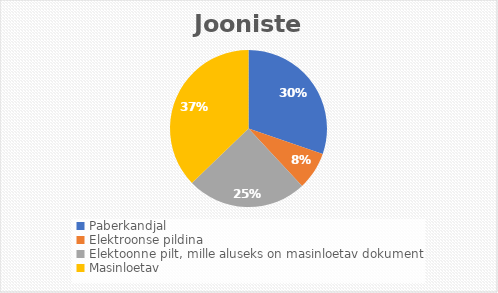
| Category | Series 0 |
|---|---|
| Paberkandjal | 4604 |
| Elektroonse pildina | 1181 |
| Elektoonne pilt, mille aluseks on masinloetav dokument | 3763 |
| Masinloetav | 5654 |